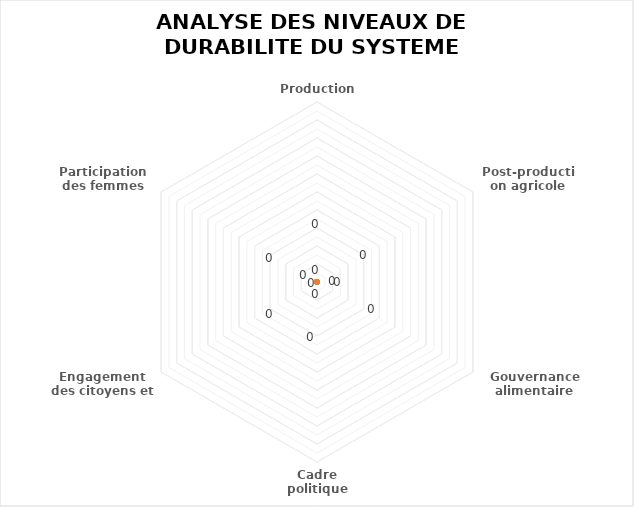
| Category | Series 0 | Series 1 |
|---|---|---|
| Production agricole | 0 | 0 |
| Post-production agricole | 0 | 0 |
| Gouvernance alimentaire locale | 0 | 0 |
| Cadre politique national | 0 | 0 |
| Engagement des citoyens et OSC | 0 | 0 |
| Participation des femmes | 0 | 0 |